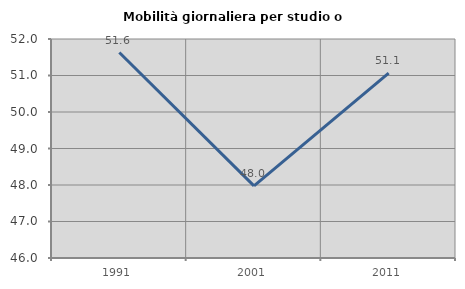
| Category | Mobilità giornaliera per studio o lavoro |
|---|---|
| 1991.0 | 51.629 |
| 2001.0 | 47.977 |
| 2011.0 | 51.064 |